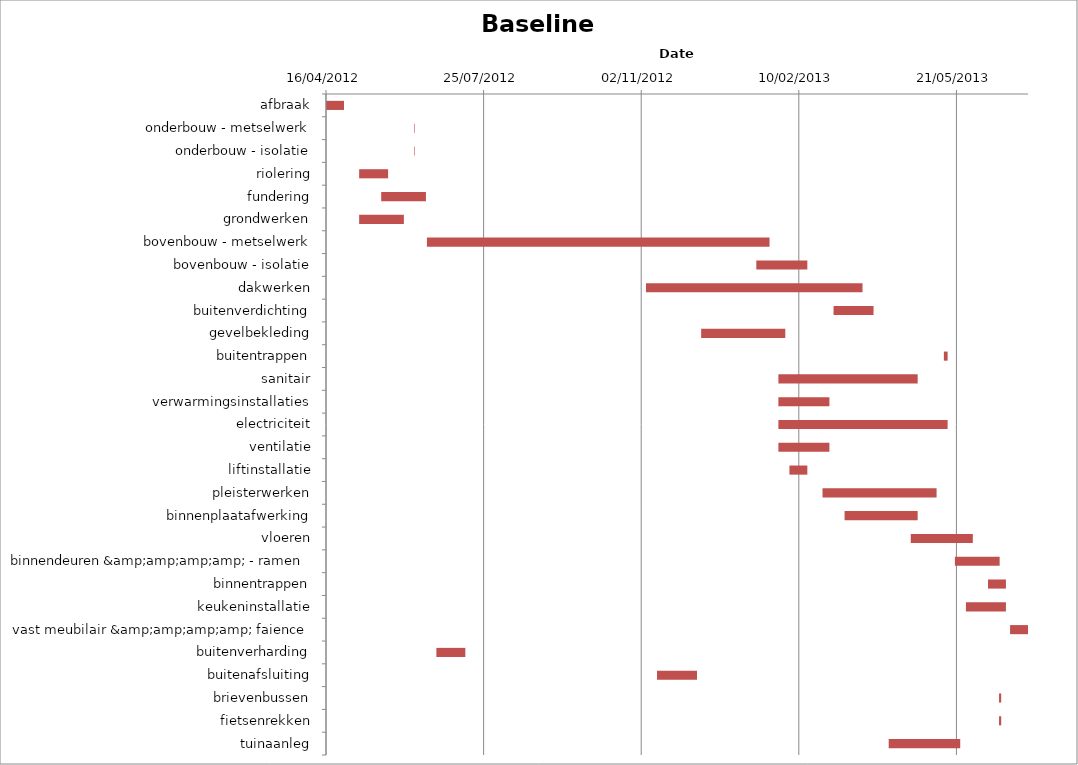
| Category | Baseline start | Actual duration |
|---|---|---|
| afbraak | 41015.333 | 11.375 |
| onderbouw - metselwerk | 41071.333 | 0.375 |
| onderbouw - isolatie | 41071.333 | 0.375 |
| riolering | 41036.333 | 18.375 |
| fundering | 41050.333 | 28.375 |
| grondwerken | 41036.333 | 28.375 |
| bovenbouw - metselwerk | 41079.333 | 217.375 |
| bovenbouw - isolatie | 41288.333 | 32.375 |
| dakwerken | 41218.333 | 137.375 |
| buitenverdichting | 41337.333 | 25.375 |
| gevelbekleding | 41253.333 | 53.375 |
| buitentrappen | 41407.333 | 2.375 |
| sanitair | 41302.333 | 88.375 |
| verwarmingsinstallaties | 41302.333 | 32.375 |
| electriciteit | 41302.333 | 107.375 |
| ventilatie | 41302.333 | 32.375 |
| liftinstallatie | 41309.333 | 11.375 |
| pleisterwerken | 41330.333 | 72.375 |
| binnenplaatafwerking | 41344.333 | 46.375 |
| vloeren | 41386.333 | 39.375 |
| binnendeuren &amp;amp;amp;amp; - ramen | 41414.333 | 28.375 |
| binnentrappen | 41435.333 | 11.375 |
| keukeninstallatie | 41421.333 | 25.375 |
| vast meubilair &amp;amp;amp;amp; faience | 41449.333 | 11.375 |
| buitenverharding | 41085.333 | 18.375 |
| buitenafsluiting | 41225.333 | 25.375 |
| brievenbussen | 41442.333 | 1.375 |
| fietsenrekken | 41442.333 | 1.375 |
| tuinaanleg | 41372.333 | 45.375 |